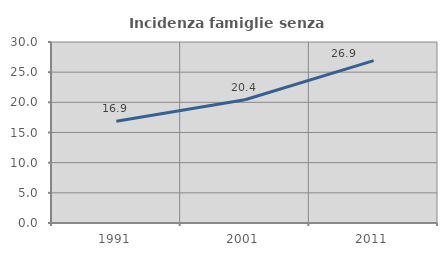
| Category | Incidenza famiglie senza nuclei |
|---|---|
| 1991.0 | 16.874 |
| 2001.0 | 20.423 |
| 2011.0 | 26.903 |